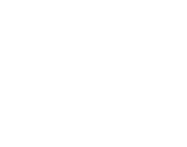
| Category | Series 0 |
|---|---|
| Communication methods | 0 |
| Communication media | 0 |
| Publication | 0 |